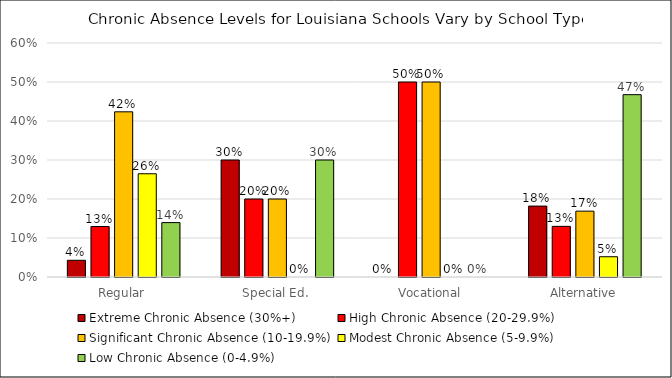
| Category | Extreme Chronic Absence (30%+) | High Chronic Absence (20-29.9%) | Significant Chronic Absence (10-19.9%) | Modest Chronic Absence (5-9.9%) | Low Chronic Absence (0-4.9%) |
|---|---|---|---|---|---|
| Regular | 0.043 | 0.129 | 0.424 | 0.265 | 0.139 |
| Special Ed. | 0.3 | 0.2 | 0.2 | 0 | 0.3 |
| Vocational | 0 | 0.5 | 0.5 | 0 | 0 |
| Alternative | 0.182 | 0.13 | 0.169 | 0.052 | 0.468 |